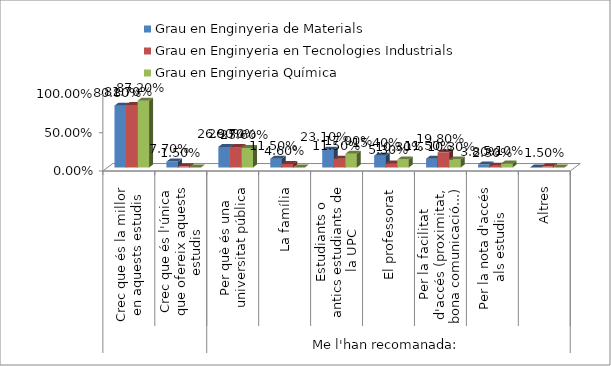
| Category | Grau en Enginyeria de Materials | Grau en Enginyeria en Tecnologies Industrials | Grau en Enginyeria Química |
|---|---|---|---|
| 0 | 0.808 | 0.817 | 0.872 |
| 1 | 0.077 | 0.015 | 0 |
| 2 | 0.269 | 0.267 | 0.256 |
| 3 | 0.115 | 0.046 | 0 |
| 4 | 0.231 | 0.115 | 0.179 |
| 5 | 0.154 | 0.053 | 0.103 |
| 6 | 0.115 | 0.198 | 0.103 |
| 7 | 0.038 | 0.023 | 0.051 |
| 8 | 0 | 0.015 | 0 |